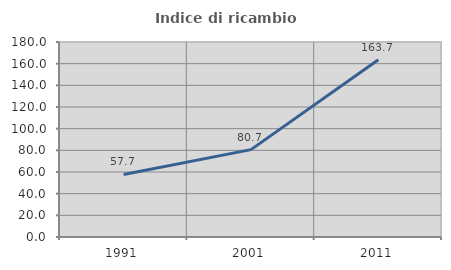
| Category | Indice di ricambio occupazionale  |
|---|---|
| 1991.0 | 57.695 |
| 2001.0 | 80.663 |
| 2011.0 | 163.666 |